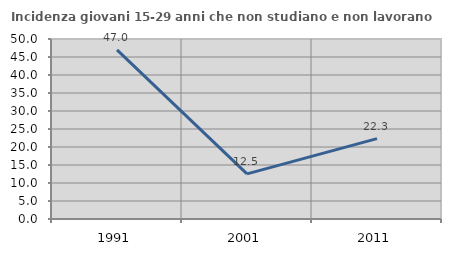
| Category | Incidenza giovani 15-29 anni che non studiano e non lavorano  |
|---|---|
| 1991.0 | 46.961 |
| 2001.0 | 12.548 |
| 2011.0 | 22.315 |